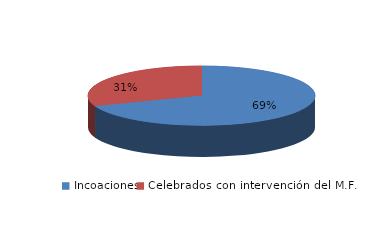
| Category | Series 0 |
|---|---|
| Incoaciones | 11421 |
| Celebrados con intervención del M.F. | 5063 |